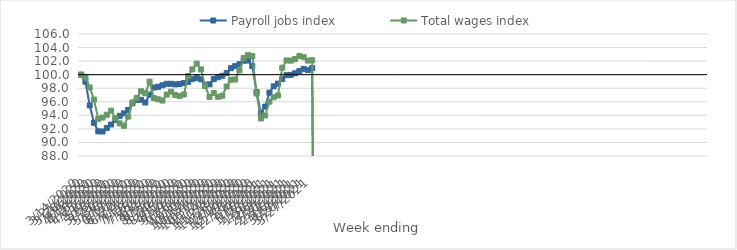
| Category | Payroll jobs index | Total wages index |
|---|---|---|
| 14/03/2020 | 100 | 100 |
| 21/03/2020 | 98.97 | 99.607 |
| 28/03/2020 | 95.464 | 98.117 |
| 04/04/2020 | 92.906 | 96.324 |
| 11/04/2020 | 91.634 | 93.472 |
| 18/04/2020 | 91.618 | 93.672 |
| 25/04/2020 | 92.147 | 94.096 |
| 02/05/2020 | 92.646 | 94.684 |
| 09/05/2020 | 93.336 | 93.578 |
| 16/05/2020 | 93.928 | 92.809 |
| 23/05/2020 | 94.284 | 92.46 |
| 30/05/2020 | 94.792 | 93.812 |
| 06/06/2020 | 95.776 | 95.91 |
| 13/06/2020 | 96.277 | 96.583 |
| 20/06/2020 | 96.294 | 97.554 |
| 27/06/2020 | 95.892 | 97.289 |
| 04/07/2020 | 97.055 | 98.973 |
| 11/07/2020 | 98.106 | 96.533 |
| 18/07/2020 | 98.208 | 96.372 |
| 25/07/2020 | 98.434 | 96.181 |
| 01/08/2020 | 98.654 | 97.055 |
| 08/08/2020 | 98.656 | 97.48 |
| 15/08/2020 | 98.564 | 96.991 |
| 22/08/2020 | 98.619 | 96.84 |
| 29/08/2020 | 98.754 | 97.076 |
| 05/09/2020 | 98.928 | 99.803 |
| 12/09/2020 | 99.342 | 100.783 |
| 19/09/2020 | 99.517 | 101.637 |
| 26/09/2020 | 99.31 | 100.779 |
| 03/10/2020 | 98.488 | 98.325 |
| 10/10/2020 | 98.579 | 96.712 |
| 17/10/2020 | 99.343 | 97.299 |
| 24/10/2020 | 99.616 | 96.732 |
| 31/10/2020 | 99.832 | 96.893 |
| 07/11/2020 | 100.231 | 98.252 |
| 14/11/2020 | 100.956 | 99.261 |
| 21/11/2020 | 101.258 | 99.291 |
| 28/11/2020 | 101.546 | 100.638 |
| 05/12/2020 | 102.06 | 102.456 |
| 12/12/2020 | 102.096 | 102.885 |
| 19/12/2020 | 101.265 | 102.743 |
| 26/12/2020 | 97.433 | 97.212 |
| 02/01/2021 | 94.376 | 93.531 |
| 09/01/2021 | 95.285 | 93.978 |
| 16/01/2021 | 97.349 | 96.028 |
| 23/01/2021 | 98.277 | 96.664 |
| 30/01/2021 | 98.681 | 96.928 |
| 06/02/2021 | 99.348 | 101.023 |
| 13/02/2021 | 99.928 | 102.099 |
| 20/02/2021 | 99.969 | 102.073 |
| 27/02/2021 | 100.21 | 102.312 |
| 06/03/2021 | 100.53 | 102.759 |
| 13/03/2021 | 100.859 | 102.584 |
| 20/03/2021 | 100.674 | 102.081 |
| 27/03/2021 | 100.974 | 102.126 |